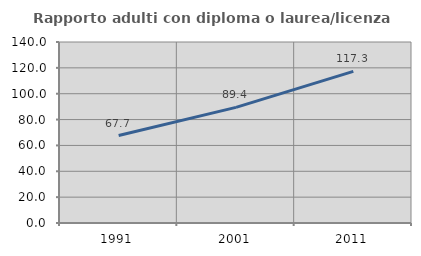
| Category | Rapporto adulti con diploma o laurea/licenza media  |
|---|---|
| 1991.0 | 67.658 |
| 2001.0 | 89.437 |
| 2011.0 | 117.275 |